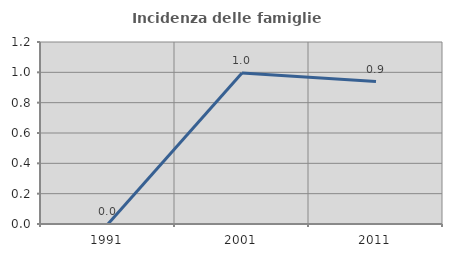
| Category | Incidenza delle famiglie numerose |
|---|---|
| 1991.0 | 0 |
| 2001.0 | 0.995 |
| 2011.0 | 0.939 |